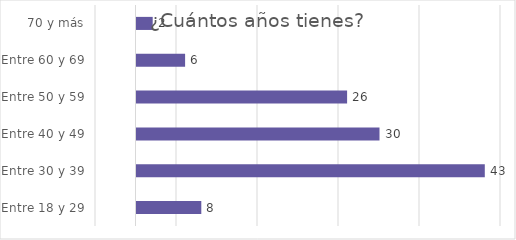
| Category | ¿Cuántos años tienes? |
|---|---|
| Entre 18 y 29 | 8 |
| Entre 30 y 39 | 43 |
| Entre 40 y 49 | 30 |
| Entre 50 y 59 | 26 |
| Entre 60 y 69 | 6 |
| 70 y más | 2 |